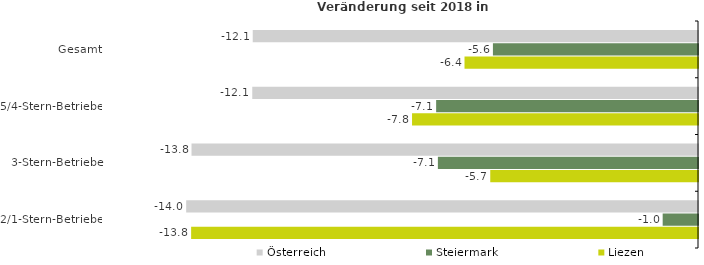
| Category | Österreich | Steiermark | Liezen |
|---|---|---|---|
| Gesamt | -12.137 | -5.59 | -6.364 |
| 5/4-Stern-Betriebe | -12.15 | -7.138 | -7.794 |
| 3-Stern-Betriebe | -13.805 | -7.09 | -5.662 |
| 2/1-Stern-Betriebe | -13.951 | -0.963 | -13.816 |